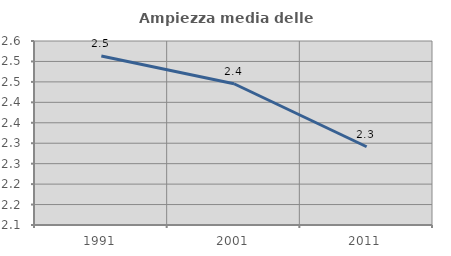
| Category | Ampiezza media delle famiglie |
|---|---|
| 1991.0 | 2.513 |
| 2001.0 | 2.445 |
| 2011.0 | 2.291 |